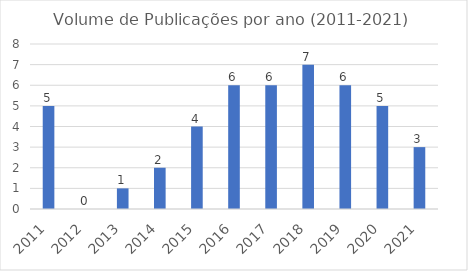
| Category | Publicacoes |
|---|---|
| 2011.0 | 5 |
| 2012.0 | 0 |
| 2013.0 | 1 |
| 2014.0 | 2 |
| 2015.0 | 4 |
| 2016.0 | 6 |
| 2017.0 | 6 |
| 2018.0 | 7 |
| 2019.0 | 6 |
| 2020.0 | 5 |
| 2021.0 | 3 |